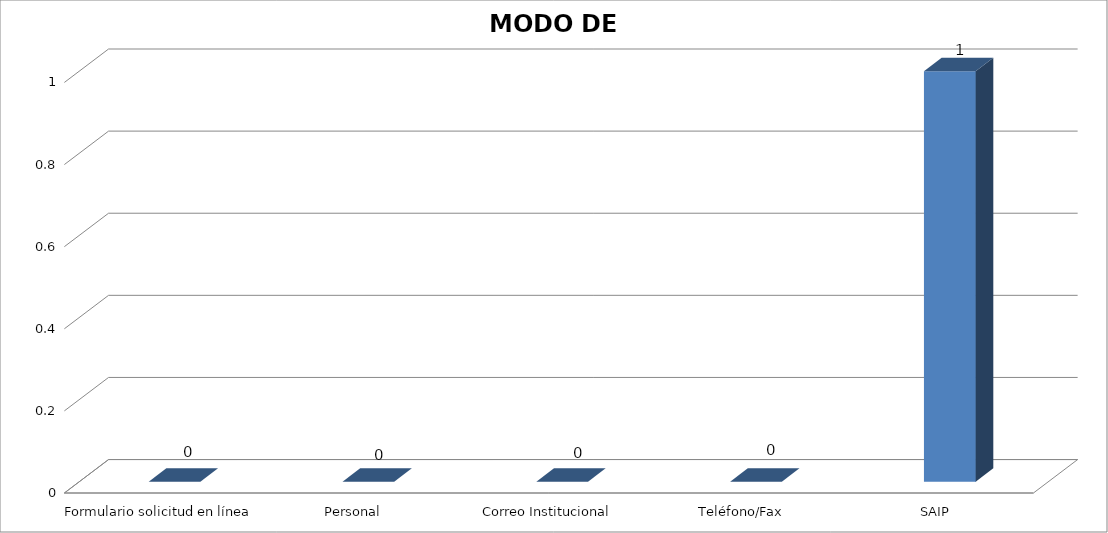
| Category | Series 0 | Series 1 | Series 2 |
|---|---|---|---|
| Formulario solicitud en línea |  | 0 |  |
| Personal |  | 0 |  |
| Correo Institucional |  | 0 |  |
| Teléfono/Fax |  | 0 |  |
| SAIP |  | 1 |  |